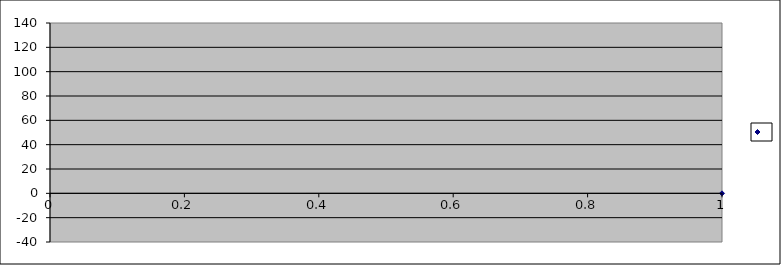
| Category | Series 0 |
|---|---|
| 0 | 0 |
| 1 | -0.1 |
| 2 | -0.1 |
| 3 | 0.2 |
| 4 | 1 |
| 5 | 2.2 |
| 6 | 2.7 |
| 7 | 2.8 |
| 8 | 4.9 |
| 9 | 7.3 |
| 10 | 10.6 |
| 11 | 5.5 |
| 12 | 7.3 |
| 13 | 8.7 |
| 14 | 9.2 |
| 15 | 9.2 |
| 16 | 9.7 |
| 17 | 14.1 |
| 18 | 15.9 |
| 19 | -2.5 |
| 20 | -1.7 |
| 21 | 0.3 |
| 22 | 0.4 |
| 23 | 0.5 |
| 24 | 0.6 |
| 25 | 1.2 |
| 26 | 1.6 |
| 27 | 1.6 |
| 28 | 2 |
| 29 | 2.3 |
| 30 | 2.4 |
| 31 | 2.6 |
| 32 | 3.1 |
| 33 | 3.8 |
| 34 | 5.4 |
| 35 | -1.1 |
| 36 | 1.1 |
| 37 | 1.3 |
| 38 | 2.7 |
| 39 | 2.9 |
| 40 | 4 |
| 41 | 4.2 |
| 42 | 4.3 |
| 43 | 4.3 |
| 44 | 4.7 |
| 45 | 5 |
| 46 | 5.3 |
| 47 | 5.4 |
| 48 | 5.7 |
| 49 | 5.7 |
| 50 | 5.9 |
| 51 | 6.2 |
| 52 | 6.3 |
| 53 | 6.7 |
| 54 | 7.3 |
| 55 | 7.6 |
| 56 | 8.3 |
| 57 | 8.8 |
| 58 | 9.2 |
| 59 | 9.2 |
| 60 | 9.4 |
| 61 | 9.6 |
| 62 | 9.9 |
| 63 | 10 |
| 64 | 10 |
| 65 | 10.3 |
| 66 | 10.9 |
| 67 | 11.9 |
| 68 | 12.6 |
| 69 | 12.9 |
| 70 | 13.5 |
| 71 | 13.6 |
| 72 | 13.7 |
| 73 | 14.4 |
| 74 | 14.5 |
| 75 | 15.9 |
| 76 | 15.9 |
| 77 | 16.6 |
| 78 | 16.7 |
| 79 | 16.8 |
| 80 | 17 |
| 81 | 17.4 |
| 82 | 17.5 |
| 83 | 17.7 |
| 84 | 18.6 |
| 85 | -6.4 |
| 86 | -5.7 |
| 87 | -2.7 |
| 88 | -1.7 |
| 89 | -1.2 |
| 90 | 0.2 |
| 91 | 0.6 |
| 92 | 2.2 |
| 93 | 2.4 |
| 94 | 2.9 |
| 95 | 3.3 |
| 96 | 3.4 |
| 97 | 3.4 |
| 98 | 3.5 |
| 99 | 3.5 |
| 100 | 3.5 |
| 101 | 3.7 |
| 102 | 4 |
| 103 | 4.3 |
| 104 | 4.5 |
| 105 | 4.7 |
| 106 | 4.8 |
| 107 | 6.1 |
| 108 | 6.3 |
| 109 | 6.8 |
| 110 | 7.3 |
| 111 | 7.7 |
| 112 | 8.2 |
| 113 | 9.2 |
| 114 | 9.5 |
| 115 | 10.6 |
| 116 | 14.9 |
| 117 | 15.6 |
| 118 | 18.5 |
| 119 | -3.65 |
| 120 | -2.02 |
| 121 | -1.09 |
| 122 | -0.64 |
| 123 | 0.07 |
| 124 | 0.11 |
| 125 | 1.01 |
| 126 | 1.23 |
| 127 | 1.55 |
| 128 | 1.83 |
| 129 | 2.2 |
| 130 | 2.27 |
| 131 | 3.26 |
| 132 | 3.43 |
| 133 | 3.58 |
| 134 | 4.34 |
| 135 | 4.91 |
| 136 | 5.02 |
| 137 | 5.03 |
| 138 | 5.04 |
| 139 | 5.58 |
| 140 | 5.72 |
| 141 | 5.89 |
| 142 | 5.94 |
| 143 | -9.09 |
| 144 | -8.06 |
| 145 | -8.01 |
| 146 | -7.98 |
| 147 | -2.9 |
| 148 | -2.74 |
| 149 | -2.74 |
| 150 | -2.67 |
| 151 | -2.59 |
| 152 | -1.97 |
| 153 | -1.43 |
| 154 | -0.44 |
| 155 | -5.4 |
| 156 | -5.3 |
| 157 | -4.2 |
| 158 | -2.9 |
| 159 | -2.5 |
| 160 | -1.9 |
| 161 | -1.2 |
| 162 | -0.4 |
| 163 | -0.2 |
| 164 | -0.2 |
| 165 | 0.6 |
| 166 | 0.6 |
| 167 | 0.7 |
| 168 | 0.8 |
| 169 | 0.8 |
| 170 | 0.9 |
| 171 | 0.9 |
| 172 | 1.3 |
| 173 | 1.3 |
| 174 | 1.4 |
| 175 | 1.5 |
| 176 | 1.5 |
| 177 | 1.5 |
| 178 | 1.5 |
| 179 | 1.7 |
| 180 | 1.7 |
| 181 | 1.9 |
| 182 | 2 |
| 183 | 2.4 |
| 184 | 3.2 |
| 185 | 3.3 |
| 186 | 3.3 |
| 187 | 3.5 |
| 188 | 3.6 |
| 189 | 3.7 |
| 190 | 3.7 |
| 191 | 3.7 |
| 192 | 3.8 |
| 193 | 3.9 |
| 194 | 4.1 |
| 195 | 4.4 |
| 196 | 4.6 |
| 197 | 4.7 |
| 198 | 4.7 |
| 199 | 4.9 |
| 200 | 5.1 |
| 201 | 5.2 |
| 202 | 5.2 |
| 203 | 5.2 |
| 204 | 5.5 |
| 205 | 5.5 |
| 206 | 5.6 |
| 207 | 5.8 |
| 208 | 5.9 |
| 209 | 6.1 |
| 210 | 6.4 |
| 211 | 6.5 |
| 212 | 6.6 |
| 213 | 6.6 |
| 214 | 6.7 |
| 215 | 6.8 |
| 216 | 6.8 |
| 217 | 7.5 |
| 218 | 8.4 |
| 219 | -21.3 |
| 220 | -16.9 |
| 221 | -10.1 |
| 222 | -7.3 |
| 223 | -2.7 |
| 224 | -2.5 |
| 225 | -1.1 |
| 226 | -0.9 |
| 227 | -7.2 |
| 228 | -7.2 |
| 229 | -6.1 |
| 230 | -4.7 |
| 231 | -3.5 |
| 232 | -3 |
| 233 | -2.1 |
| 234 | -1.4 |
| 235 | 2 |
| 236 | 2.4 |
| 237 | 2.5 |
| 238 | 2.7 |
| 239 | 2.8 |
| 240 | 3.4 |
| 241 | 3.9 |
| 242 | 4.1 |
| 243 | 4.2 |
| 244 | -0.5 |
| 245 | -0.3 |
| 246 | 0 |
| 247 | 0 |
| 248 | 0.3 |
| 249 | 0.5 |
| 250 | 1.8 |
| 251 | 2 |
| 252 | 2.4 |
| 253 | 2.5 |
| 254 | 2.5 |
| 255 | 2.6 |
| 256 | 2.6 |
| 257 | 2.6 |
| 258 | 2.8 |
| 259 | 2.9 |
| 260 | 2.9 |
| 261 | 2.9 |
| 262 | 3.1 |
| 263 | 3.1 |
| 264 | 3.1 |
| 265 | 3.4 |
| 266 | 3.4 |
| 267 | 3.6 |
| 268 | 3.7 |
| 269 | 3.7 |
| 270 | 3.7 |
| 271 | 3.7 |
| 272 | 3.7 |
| 273 | 3.7 |
| 274 | 3.8 |
| 275 | 3.9 |
| 276 | 3.9 |
| 277 | 3.9 |
| 278 | 3.9 |
| 279 | 3.9 |
| 280 | 3.9 |
| 281 | 4.1 |
| 282 | 4.2 |
| 283 | 4.2 |
| 284 | 4.4 |
| 285 | 4.4 |
| 286 | 4.4 |
| 287 | 4.4 |
| 288 | 4.4 |
| 289 | 4.7 |
| 290 | 4.7 |
| 291 | 4.9 |
| 292 | 4.9 |
| 293 | 4.9 |
| 294 | 5.1 |
| 295 | 5.1 |
| 296 | 5.2 |
| 297 | 5.2 |
| 298 | 5.2 |
| 299 | 5.2 |
| 300 | 5.4 |
| 301 | 5.4 |
| 302 | 5.4 |
| 303 | 5.4 |
| 304 | 5.4 |
| 305 | 5.5 |
| 306 | 5.5 |
| 307 | 5.6 |
| 308 | 5.6 |
| 309 | 5.7 |
| 310 | 5.7 |
| 311 | 5.7 |
| 312 | 5.7 |
| 313 | 5.7 |
| 314 | 5.7 |
| 315 | 5.8 |
| 316 | 6 |
| 317 | 6.2 |
| 318 | 6.5 |
| 319 | 6.5 |
| 320 | 6.7 |
| 321 | 6.7 |
| 322 | 7.2 |
| 323 | 7.2 |
| 324 | 7.5 |
| 325 | 7.5 |
| 326 | 7.8 |
| 327 | 8.5 |
| 328 | 8.8 |
| 329 | 10.3 |
| 330 | -9.7 |
| 331 | -8.5 |
| 332 | -8.5 |
| 333 | -6.9 |
| 334 | -6.8 |
| 335 | -5.9 |
| 336 | -5.8 |
| 337 | -5.7 |
| 338 | -5.5 |
| 339 | -5.4 |
| 340 | -4.9 |
| 341 | -4.6 |
| 342 | -4.4 |
| 343 | -4.4 |
| 344 | -4.1 |
| 345 | -4.1 |
| 346 | -4 |
| 347 | -3.9 |
| 348 | -3.6 |
| 349 | -3.6 |
| 350 | -3 |
| 351 | -2.9 |
| 352 | -2.5 |
| 353 | -2.3 |
| 354 | -2.2 |
| 355 | -1.9 |
| 356 | -0.9 |
| 357 | -0.8 |
| 358 | -0.6 |
| 359 | -0.6 |
| 360 | -0.4 |
| 361 | 2.2 |
| 362 | 2.5 |
| 363 | -6.06 |
| 364 | -5.48 |
| 365 | -5.46 |
| 366 | -4.4 |
| 367 | -4.29 |
| 368 | -3.38 |
| 369 | -2.8 |
| 370 | -2.12 |
| 371 | -1.92 |
| 372 | -1.22 |
| 373 | -0.73 |
| 374 | 0.75 |
| 375 | 0.86 |
| 376 | -11.633 |
| 377 | -1.329 |
| 378 | 0.604 |
| 379 | 1.468 |
| 380 | 3.262 |
| 381 | 5.869 |
| 382 | 6.814 |
| 383 | 7.475 |
| 384 | 8.125 |
| 385 | 9.097 |
| 386 | 9.157 |
| 387 | 9.535 |
| 388 | 12.019 |
| 389 | 12.192 |
| 390 | 14.42 |
| 391 | 14.49 |
| 392 | 15.742 |
| 393 | 15.94 |
| 394 | 17.097 |
| 395 | 17.485 |
| 396 | 18.292 |
| 397 | 20.046 |
| 398 | 20.8 |
| 399 | 21.65 |
| 400 | 22.275 |
| 401 | 22.497 |
| 402 | 23.163 |
| 403 | 23.21 |
| 404 | 23.541 |
| 405 | 23.541 |
| 406 | 24.877 |
| 407 | 26.634 |
| 408 | 28.863 |
| 409 | 29.101 |
| 410 | 29.439 |
| 411 | 29.758 |
| 412 | 31.802 |
| 413 | 32.853 |
| 414 | 37.576 |
| 415 | -11.9 |
| 416 | -8.2 |
| 417 | -4.8 |
| 418 | -3.8 |
| 419 | -1.5 |
| 420 | -0.5 |
| 421 | -0.3 |
| 422 | -0.2 |
| 423 | 1.6 |
| 424 | 3.9 |
| 425 | 4.4 |
| 426 | 5.3 |
| 427 | 5.4 |
| 428 | 5.6 |
| 429 | 6.1 |
| 430 | 6.1 |
| 431 | 6.4 |
| 432 | -4.7 |
| 433 | -4.3 |
| 434 | -4.1 |
| 435 | -3.4 |
| 436 | -3.3 |
| 437 | -3.1 |
| 438 | -2.6 |
| 439 | -2.5 |
| 440 | 1.6 |
| 441 | 1.7 |
| 442 | 2.6 |
| 443 | 2.7 |
| 444 | 2.8 |
| 445 | 3.4 |
| 446 | -2.32 |
| 447 | -1.76 |
| 448 | -1.54 |
| 449 | -0.99 |
| 450 | -0.76 |
| 451 | -0.26 |
| 452 | 0.61 |
| 453 | 0.72 |
| 454 | 0.93 |
| 455 | 1.26 |
| 456 | 1.77 |
| 457 | 3.32 |
| 458 | 3.37 |
| 459 | 3.41 |
| 460 | 3.42 |
| 461 | 3.59 |
| 462 | -5.3 |
| 463 | -5 |
| 464 | -4.84 |
| 465 | -4 |
| 466 | -3.6 |
| 467 | -3.2 |
| 468 | -2.7 |
| 469 | -1.5 |
| 470 | -1.4 |
| 471 | -1 |
| 472 | 0.1 |
| 473 | 0.5 |
| 474 | 0.7 |
| 475 | 1.8 |
| 476 | 4.6 |
| 477 | 4.9 |
| 478 | 5.5 |
| 479 | 5.8 |
| 480 | 6.3 |
| 481 | 6.4 |
| 482 | 6.5 |
| 483 | 6.8 |
| 484 | 6.9 |
| 485 | 7 |
| 486 | 7.2 |
| 487 | 12.1 |
| 488 | 12.2 |
| 489 | 13.5 |
| 490 | 13.7 |
| 491 | 14.6 |
| 492 | 15.1 |
| 493 | 15.4 |
| 494 | 15.6 |
| 495 | 15.6 |
| 496 | 15.9 |
| 497 | 16 |
| 498 | 16.1 |
| 499 | 16.1 |
| 500 | 16.7 |
| 501 | 17.6 |
| 502 | 0.07 |
| 503 | 0.11 |
| 504 | 1.23 |
| 505 | 1.37 |
| 506 | 1.47 |
| 507 | 2.38 |
| 508 | 2.93 |
| 509 | 3.16 |
| 510 | 3.53 |
| 511 | 3.76 |
| 512 | 3.81 |
| 513 | 3.97 |
| 514 | 4.04 |
| 515 | 4.34 |
| 516 | 4.42 |
| 517 | 4.52 |
| 518 | 4.58 |
| 519 | 4.6 |
| 520 | 4.69 |
| 521 | 5.01 |
| 522 | 5.02 |
| 523 | 5.03 |
| 524 | 5.63 |
| 525 | 5.89 |
| 526 | 5.94 |
| 527 | -10.5 |
| 528 | -9.8 |
| 529 | -5.7 |
| 530 | -5 |
| 531 | -4.7 |
| 532 | -3.7 |
| 533 | -12.4 |
| 534 | -6.9 |
| 535 | -6.6 |
| 536 | -6.2 |
| 537 | -5.4 |
| 538 | -4.4 |
| 539 | -3.8 |
| 540 | -3 |
| 541 | -2.2 |
| 542 | -1.8 |
| 543 | -1.1 |
| 544 | 0.3 |
| 545 | 0.9 |
| 546 | 4.5 |
| 547 | 4.8 |
| 548 | 8 |
| 549 | 10.5 |
| 550 | -6.7 |
| 551 | -6.1 |
| 552 | -4.5 |
| 553 | -4.3 |
| 554 | -4.3 |
| 555 | -3.4 |
| 556 | -3.2 |
| 557 | -0.2 |
| 558 | -0.2 |
| 559 | 1.9 |
| 560 | 2.5 |
| 561 | 2.8 |
| 562 | -9 |
| 563 | -16.4 |
| 564 | -16.1 |
| 565 | -9 |
| 566 | -8.7 |
| 567 | -25 |
| 568 | -22.9 |
| 569 | -21.2 |
| 570 | -20.7 |
| 571 | -20.2 |
| 572 | -19.6 |
| 573 | -19.5 |
| 574 | -18.7 |
| 575 | -18.6 |
| 576 | -18.6 |
| 577 | -17.3 |
| 578 | -25.3 |
| 579 | -21.3 |
| 580 | -21.1 |
| 581 | -19.2 |
| 582 | -19.1 |
| 583 | -18.4 |
| 584 | -16.8 |
| 585 | -15.4 |
| 586 | -15.2 |
| 587 | -14.2 |
| 588 | -13.2 |
| 589 | -12.9 |
| 590 | -10.5 |
| 591 | 3.8 |
| 592 | -20.4 |
| 593 | -14.5 |
| 594 | -14.2 |
| 595 | -14 |
| 596 | -13.9 |
| 597 | -13.8 |
| 598 | -13.6 |
| 599 | -13.4 |
| 600 | -12.7 |
| 601 | -11.9 |
| 602 | -11.9 |
| 603 | -11.8 |
| 604 | -11.7 |
| 605 | -11.6 |
| 606 | -11.2 |
| 607 | -10.8 |
| 608 | -10.4 |
| 609 | -10.3 |
| 610 | -10.2 |
| 611 | -9 |
| 612 | -8.9 |
| 613 | -8.8 |
| 614 | -1.2 |
| 615 | -0.4 |
| 616 | 0.2 |
| 617 | 1 |
| 618 | 1.6 |
| 619 | 2 |
| 620 | 2.1 |
| 621 | 2.2 |
| 622 | 3 |
| 623 | 3.1 |
| 624 | 3.4 |
| 625 | 3.7 |
| 626 | 3.8 |
| 627 | 4.5 |
| 628 | 4.7 |
| 629 | 7.2 |
| 630 | -12.3 |
| 631 | -12 |
| 632 | -11.7 |
| 633 | -11.2 |
| 634 | -11 |
| 635 | -9.6 |
| 636 | -9.1 |
| 637 | -8.9 |
| 638 | -8.8 |
| 639 | -8.2 |
| 640 | -8 |
| 641 | -6.2 |
| 642 | -6 |
| 643 | -5.2 |
| 644 | -4.6 |
| 645 | -3.6 |
| 646 | -15.8 |
| 647 | -13.5 |
| 648 | -15.8 |
| 649 | -15.3 |
| 650 | -15.3 |
| 651 | -10.1 |
| 652 | -14.3 |
| 653 | -15.6 |
| 654 | -11.2 |
| 655 | -19 |
| 656 | -13.8 |
| 657 | -16.9 |
| 658 | -16.4 |
| 659 | -7.9 |
| 660 | -8 |
| 661 | -9.9 |
| 662 | -8.8 |
| 663 | -9.2 |
| 664 | -5.5 |
| 665 | -7.1 |
| 666 | -4.8 |
| 667 | -7.2 |
| 668 | -5.5 |
| 669 | -8.3 |
| 670 | -3.9 |
| 671 | -6.8 |
| 672 | -0.6 |
| 673 | -4.7 |
| 674 | -4 |
| 675 | 1.5 |
| 676 | -6.7 |
| 677 | -0.7 |
| 678 | -3.1 |
| 679 | -6.5 |
| 680 | 0.5 |
| 681 | -7.2 |
| 682 | -3.7 |
| 683 | -4.9 |
| 684 | -5.72 |
| 685 | -7.77 |
| 686 | -5.43 |
| 687 | -6.54 |
| 688 | -2.61 |
| 689 | -6.01 |
| 690 | -7.4 |
| 691 | -6.98 |
| 692 | -5.19 |
| 693 | -4.41 |
| 694 | -3.96 |
| 695 | -5.89 |
| 696 | -9.3 |
| 697 | -3.81 |
| 698 | -4.89 |
| 699 | -3.52 |
| 700 | -1.96 |
| 701 | -6.91 |
| 702 | -0.94 |
| 703 | -17.9 |
| 704 | -14.9 |
| 705 | -14.6 |
| 706 | -14.1 |
| 707 | -13.2 |
| 708 | -12.7 |
| 709 | -9.1 |
| 710 | -7.8 |
| 711 | -7.5 |
| 712 | -6.1 |
| 713 | -19.8 |
| 714 | -19.5 |
| 715 | -14.9 |
| 716 | -12.7 |
| 717 | -12.5 |
| 718 | -12.2 |
| 719 | -12.1 |
| 720 | -11.7 |
| 721 | -11.5 |
| 722 | -10.8 |
| 723 | -10.7 |
| 724 | -10.6 |
| 725 | -10.3 |
| 726 | -10.2 |
| 727 | -10 |
| 728 | -9.8 |
| 729 | -9.4 |
| 730 | -9.3 |
| 731 | -8.9 |
| 732 | -7.5 |
| 733 | -5.9 |
| 734 | -5.8 |
| 735 | -5 |
| 736 | -2.2 |
| 737 | -14.1 |
| 738 | -13.7 |
| 739 | -13.5 |
| 740 | -13.5 |
| 741 | -13.4 |
| 742 | -12.8 |
| 743 | -12.6 |
| 744 | -12.5 |
| 745 | -12.1 |
| 746 | -12.1 |
| 747 | -11.8 |
| 748 | -11.7 |
| 749 | -11.7 |
| 750 | -11.6 |
| 751 | -11.2 |
| 752 | -11.2 |
| 753 | -10.8 |
| 754 | -10.7 |
| 755 | -10.7 |
| 756 | -10.6 |
| 757 | -10.6 |
| 758 | -10.5 |
| 759 | -10.5 |
| 760 | -9.9 |
| 761 | -9.8 |
| 762 | -9.8 |
| 763 | -9.5 |
| 764 | -9.4 |
| 765 | -9.4 |
| 766 | -9.2 |
| 767 | -20.2 |
| 768 | -18.4 |
| 769 | -16.4 |
| 770 | -15.9 |
| 771 | -15.6 |
| 772 | -15.1 |
| 773 | -15.1 |
| 774 | -14.9 |
| 775 | -14.9 |
| 776 | -14.6 |
| 777 | -14.6 |
| 778 | -14.1 |
| 779 | -14.1 |
| 780 | -13.9 |
| 781 | -13.9 |
| 782 | -13.6 |
| 783 | -13.3 |
| 784 | -13.1 |
| 785 | -12.6 |
| 786 | -12.1 |
| 787 | -11.6 |
| 788 | -11.3 |
| 789 | -10.3 |
| 790 | -10.3 |
| 791 | -9 |
| 792 | -8.8 |
| 793 | -6 |
| 794 | -5.5 |
| 795 | -4.8 |
| 796 | 1.6 |
| 797 | -17.7 |
| 798 | -14.7 |
| 799 | -14.2 |
| 800 | -13.4 |
| 801 | -13.1 |
| 802 | -12.9 |
| 803 | -12.9 |
| 804 | -12.9 |
| 805 | -12 |
| 806 | -12 |
| 807 | -11.7 |
| 808 | -9.1 |
| 809 | -8 |
| 810 | -7.4 |
| 811 | -5.7 |
| 812 | -3.1 |
| 813 | -0.3 |
| 814 | -0.1 |
| 815 | 20.1 |
| 816 | 20.9 |
| 817 | 21 |
| 818 | -27.3 |
| 819 | -22 |
| 820 | -21.9 |
| 821 | -15.5 |
| 822 | -15.5 |
| 823 | -14.6 |
| 824 | -14 |
| 825 | -14 |
| 826 | -13.4 |
| 827 | -12 |
| 828 | -10.9 |
| 829 | -29.9 |
| 830 | -29.3 |
| 831 | -28.9 |
| 832 | -28.2 |
| 833 | -26 |
| 834 | -26 |
| 835 | -23.9 |
| 836 | -22.5 |
| 837 | -21.6 |
| 838 | -20.5 |
| 839 | -20 |
| 840 | -19.5 |
| 841 | -18 |
| 842 | -17.5 |
| 843 | -16.6 |
| 844 | -16.5 |
| 845 | -16.3 |
| 846 | -15.4 |
| 847 | -15.1 |
| 848 | -14.6 |
| 849 | -14.5 |
| 850 | -14 |
| 851 | -13.5 |
| 852 | -13.3 |
| 853 | -12.9 |
| 854 | -12.3 |
| 855 | -12.2 |
| 856 | -11.9 |
| 857 | -11.8 |
| 858 | -11.7 |
| 859 | -11.3 |
| 860 | -11.2 |
| 861 | -10.7 |
| 862 | -10.3 |
| 863 | -5.4 |
| 864 | -5.2 |
| 865 | -4.1 |
| 866 | -3.1 |
| 867 | -13.42 |
| 868 | -12.644 |
| 869 | -11.8 |
| 870 | -11.554 |
| 871 | -11.134 |
| 872 | -10.944 |
| 873 | -10.833 |
| 874 | -10.616 |
| 875 | -10.356 |
| 876 | -10.317 |
| 877 | -10.28 |
| 878 | -10.28 |
| 879 | -10.264 |
| 880 | -10.097 |
| 881 | -10.097 |
| 882 | -10.059 |
| 883 | -10.025 |
| 884 | -10.025 |
| 885 | -9.989 |
| 886 | -9.838 |
| 887 | -9.801 |
| 888 | -9.801 |
| 889 | -9.748 |
| 890 | -9.579 |
| 891 | -9.543 |
| 892 | -9.543 |
| 893 | -9.514 |
| 894 | -9.49 |
| 895 | -9.384 |
| 896 | -9.319 |
| 897 | -9.297 |
| 898 | -9.283 |
| 899 | -9.259 |
| 900 | -9.259 |
| 901 | -9.06 |
| 902 | -9.06 |
| 903 | -9.027 |
| 904 | -9.027 |
| 905 | -8.974 |
| 906 | -8.863 |
| 907 | -8.77 |
| 908 | -8.749 |
| 909 | -8.716 |
| 910 | -8.716 |
| 911 | -8.542 |
| 912 | -8.542 |
| 913 | -8.512 |
| 914 | -8.494 |
| 915 | -8.494 |
| 916 | -8.494 |
| 917 | -8.458 |
| 918 | -8.458 |
| 919 | -8.431 |
| 920 | -8.363 |
| 921 | -8.343 |
| 922 | -8.254 |
| 923 | -8.254 |
| 924 | -8.239 |
| 925 | -8.2 |
| 926 | -8.083 |
| 927 | -8.006 |
| 928 | -7.991 |
| 929 | -7.991 |
| 930 | -7.991 |
| 931 | -7.747 |
| 932 | -7.747 |
| 933 | -7.747 |
| 934 | -7.747 |
| 935 | -7.747 |
| 936 | -7.684 |
| 937 | -7.586 |
| 938 | -7.473 |
| 939 | -7.231 |
| 940 | -7.231 |
| 941 | -7.068 |
| 942 | -6.715 |
| 943 | -6.708 |
| 944 | -6.652 |
| 945 | -6.456 |
| 946 | -6.453 |
| 947 | -6.394 |
| 948 | -6.197 |
| 949 | -6.033 |
| 950 | -4.907 |
| 951 | -4.846 |
| 952 | -4.588 |
| 953 | -3.901 |
| 954 | -3.901 |
| 955 | -3.874 |
| 956 | -3.391 |
| 957 | -3.184 |
| 958 | -2.625 |
| 959 | -2.583 |
| 960 | -2.325 |
| 961 | -2.067 |
| 962 | -1.89 |
| 963 | -1.35 |
| 964 | -1.292 |
| 965 | -0.854 |
| 966 | -12.5 |
| 967 | -12.3 |
| 968 | -11.2 |
| 969 | -11.1 |
| 970 | -11 |
| 971 | -10.9 |
| 972 | -10.8 |
| 973 | -10.7 |
| 974 | -10.5 |
| 975 | -10.4 |
| 976 | -10.3 |
| 977 | -10.2 |
| 978 | -9.7 |
| 979 | -9.7 |
| 980 | -9.6 |
| 981 | -9.6 |
| 982 | -9.5 |
| 983 | -9.3 |
| 984 | -9.3 |
| 985 | -9.2 |
| 986 | -9.2 |
| 987 | -9 |
| 988 | -8.8 |
| 989 | -8.7 |
| 990 | -8.4 |
| 991 | -8.4 |
| 992 | -8.4 |
| 993 | -8.4 |
| 994 | -8.4 |
| 995 | -8.3 |
| 996 | -8.2 |
| 997 | -8.2 |
| 998 | -8 |
| 999 | -7.9 |
| 1000 | -7.9 |
| 1001 | -7.8 |
| 1002 | -7.6 |
| 1003 | -7.5 |
| 1004 | -7.5 |
| 1005 | -7.4 |
| 1006 | -7.4 |
| 1007 | -7.1 |
| 1008 | -7 |
| 1009 | -6.7 |
| 1010 | -6.3 |
| 1011 | -6 |
| 1012 | -4.6 |
| 1013 | -2.9 |
| 1014 | -2.8 |
| 1015 | -2.4 |
| 1016 | -1.9 |
| 1017 | -29.9 |
| 1018 | -29.3 |
| 1019 | -28.9 |
| 1020 | -28.2 |
| 1021 | -26 |
| 1022 | -26 |
| 1023 | -23.9 |
| 1024 | -23 |
| 1025 | -22.5 |
| 1026 | -21.6 |
| 1027 | -21.5 |
| 1028 | -20.9 |
| 1029 | -20 |
| 1030 | -19.5 |
| 1031 | -18.1 |
| 1032 | -18 |
| 1033 | -17.9 |
| 1034 | -17 |
| 1035 | -17 |
| 1036 | -16.7 |
| 1037 | -16.6 |
| 1038 | -16.6 |
| 1039 | -16.5 |
| 1040 | -16.4 |
| 1041 | -15.4 |
| 1042 | -15.4 |
| 1043 | -15.1 |
| 1044 | -14.9 |
| 1045 | -14.7 |
| 1046 | -14.6 |
| 1047 | -14.1 |
| 1048 | -13.5 |
| 1049 | -13.2 |
| 1050 | -12.7 |
| 1051 | -15.8 |
| 1052 | -15.7 |
| 1053 | -15.5 |
| 1054 | -15.5 |
| 1055 | -15.5 |
| 1056 | -15.4 |
| 1057 | -15.4 |
| 1058 | -15.4 |
| 1059 | -15.3 |
| 1060 | -15.3 |
| 1061 | -15.3 |
| 1062 | -15.2 |
| 1063 | -15.2 |
| 1064 | -15.2 |
| 1065 | -15.2 |
| 1066 | -15.2 |
| 1067 | -15.1 |
| 1068 | -15.1 |
| 1069 | -15.1 |
| 1070 | -15.1 |
| 1071 | -15.1 |
| 1072 | -15 |
| 1073 | -15 |
| 1074 | -15 |
| 1075 | -15 |
| 1076 | -15 |
| 1077 | -15 |
| 1078 | -14.9 |
| 1079 | -14.9 |
| 1080 | -14.8 |
| 1081 | -14.8 |
| 1082 | -14.8 |
| 1083 | -14.8 |
| 1084 | -14.7 |
| 1085 | -14.7 |
| 1086 | -14.7 |
| 1087 | -14.6 |
| 1088 | -14.6 |
| 1089 | -14.6 |
| 1090 | -14.5 |
| 1091 | -14.5 |
| 1092 | -14.3 |
| 1093 | -14.2 |
| 1094 | -13.9 |
| 1095 | -13.8 |
| 1096 | -13.8 |
| 1097 | -13.8 |
| 1098 | -13.8 |
| 1099 | -13.7 |
| 1100 | -13.6 |
| 1101 | -13.6 |
| 1102 | -13.4 |
| 1103 | -13.2 |
| 1104 | -13 |
| 1105 | -12.9 |
| 1106 | -12.8 |
| 1107 | -12.8 |
| 1108 | -12.7 |
| 1109 | -12.7 |
| 1110 | -12.6 |
| 1111 | -12.5 |
| 1112 | -12.5 |
| 1113 | -12.5 |
| 1114 | -12.5 |
| 1115 | -12.5 |
| 1116 | -12.4 |
| 1117 | -12.4 |
| 1118 | -12.3 |
| 1119 | -12.3 |
| 1120 | -12.3 |
| 1121 | -12.3 |
| 1122 | -12.3 |
| 1123 | -12.3 |
| 1124 | -12.2 |
| 1125 | -12.2 |
| 1126 | -12.2 |
| 1127 | -12.2 |
| 1128 | -12.2 |
| 1129 | -12.2 |
| 1130 | -12.2 |
| 1131 | -12.1 |
| 1132 | -12.1 |
| 1133 | -12 |
| 1134 | -12 |
| 1135 | -12 |
| 1136 | -11.9 |
| 1137 | -11.9 |
| 1138 | -11.8 |
| 1139 | -11.4 |
| 1140 | -11.4 |
| 1141 | 15.8 |
| 1142 | 16.3 |
| 1143 | 16.4 |
| 1144 | 16.6 |
| 1145 | 16.7 |
| 1146 | 16.8 |
| 1147 | 16.9 |
| 1148 | 17.4 |
| 1149 | 17.6 |
| 1150 | 17.9 |
| 1151 | 18 |
| 1152 | 18.2 |
| 1153 | 18.3 |
| 1154 | 18.4 |
| 1155 | 18.4 |
| 1156 | 18.7 |
| 1157 | 18.7 |
| 1158 | 22.3 |
| 1159 | 23.9 |
| 1160 | 23.9 |
| 1161 | 25.1 |
| 1162 | 27.3 |
| 1163 | 27.3 |
| 1164 | 28.3 |
| 1165 | 28.4 |
| 1166 | 28.7 |
| 1167 | 28.8 |
| 1168 | 28.8 |
| 1169 | 28.9 |
| 1170 | 29 |
| 1171 | 32.3 |
| 1172 | 33.1 |
| 1173 | 33.2 |
| 1174 | 34.4 |
| 1175 | 35.5 |
| 1176 | 35.8 |
| 1177 | 35.9 |
| 1178 | 36 |
| 1179 | 36.1 |
| 1180 | 36.2 |
| 1181 | 36.6 |
| 1182 | 36.6 |
| 1183 | 36.7 |
| 1184 | 36.9 |
| 1185 | 37.2 |
| 1186 | 37.5 |
| 1187 | 38.4 |
| 1188 | 40.5 |
| 1189 | 41.8 |
| 1190 | 41.8 |
| 1191 | 43.1 |
| 1192 | 43.1 |
| 1193 | 43.2 |
| 1194 | 43.7 |
| 1195 | 43.8 |
| 1196 | 43.9 |
| 1197 | 44.6 |
| 1198 | 45.6 |
| 1199 | 46.2 |
| 1200 | 46.5 |
| 1201 | 47 |
| 1202 | 55.8 |
| 1203 | 15.3 |
| 1204 | 17.5 |
| 1205 | 20 |
| 1206 | 20.1 |
| 1207 | 21.7 |
| 1208 | 22.2 |
| 1209 | 23 |
| 1210 | 23.1 |
| 1211 | 23.9 |
| 1212 | 24.2 |
| 1213 | 24.6 |
| 1214 | 24.7 |
| 1215 | 25.8 |
| 1216 | 27.4 |
| 1217 | 27.8 |
| 1218 | 27.8 |
| 1219 | 28.2 |
| 1220 | 28.4 |
| 1221 | 28.4 |
| 1222 | 30.5 |
| 1223 | 30.5 |
| 1224 | 31 |
| 1225 | 31.1 |
| 1226 | 31.2 |
| 1227 | 31.5 |
| 1228 | 31.8 |
| 1229 | 32 |
| 1230 | 33.4 |
| 1231 | 33.7 |
| 1232 | 35.1 |
| 1233 | 35.2 |
| 1234 | 35.3 |
| 1235 | 35.6 |
| 1236 | 35.6 |
| 1237 | 36.7 |
| 1238 | 37.4 |
| 1239 | 37.6 |
| 1240 | 37.8 |
| 1241 | 37.9 |
| 1242 | 38.1 |
| 1243 | 38.2 |
| 1244 | 38.4 |
| 1245 | 38.9 |
| 1246 | 39.1 |
| 1247 | 39.2 |
| 1248 | 39.4 |
| 1249 | 39.8 |
| 1250 | 39.8 |
| 1251 | 40.9 |
| 1252 | 41.4 |
| 1253 | 41.9 |
| 1254 | 42.8 |
| 1255 | 43.3 |
| 1256 | 43.7 |
| 1257 | 44.2 |
| 1258 | 44.9 |
| 1259 | 45.5 |
| 1260 | 48.5 |
| 1261 | 49.2 |
| 1262 | -7.67 |
| 1263 | -6.04 |
| 1264 | -5.4 |
| 1265 | -5.3 |
| 1266 | -4.7 |
| 1267 | -4.44 |
| 1268 | -3.1 |
| 1269 | -2.7 |
| 1270 | -2.5 |
| 1271 | -1.45 |
| 1272 | -1.4 |
| 1273 | -1.2 |
| 1274 | -1.2 |
| 1275 | -0.9 |
| 1276 | -0.57 |
| 1277 | -0.1 |
| 1278 | 1.38 |
| 1279 | 1.4 |
| 1280 | 1.7 |
| 1281 | 1.8 |
| 1282 | 2.1 |
| 1283 | 2.2 |
| 1284 | 2.36 |
| 1285 | 2.6 |
| 1286 | 3 |
| 1287 | 3.1 |
| 1288 | 3.3 |
| 1289 | 3.75 |
| 1290 | 4.3 |
| 1291 | 4.8 |
| 1292 | 5.1 |
| 1293 | 6 |
| 1294 | 6.3 |
| 1295 | 6.3 |
| 1296 | 6.8 |
| 1297 | 6.9 |
| 1298 | 7 |
| 1299 | 7.2 |
| 1300 | 7.4 |
| 1301 | 8.4 |
| 1302 | 9.6 |
| 1303 | 10 |
| 1304 | 12.1 |
| 1305 | 12.5 |
| 1306 | 13.5 |
| 1307 | 14.4 |
| 1308 | 14.9 |
| 1309 | 14.9 |
| 1310 | 14.9 |
| 1311 | 15.7 |
| 1312 | 16.7 |
| 1313 | 17.3 |
| 1314 | 18.9 |
| 1315 | 19.5 |
| 1316 | 20.3 |
| 1317 | 21.3 |
| 1318 | 21.4 |
| 1319 | 21.6 |
| 1320 | 22.5 |
| 1321 | 24.4 |
| 1322 | 25.5 |
| 1323 | 28.1 |
| 1324 | 28.8 |
| 1325 | 31.1 |
| 1326 | 33.6 |
| 1327 | 35.1 |
| 1328 | 35.5 |
| 1329 | 36.5 |
| 1330 | 38.3 |
| 1331 | 39.5 |
| 1332 | 32.7 |
| 1333 | 33.3 |
| 1334 | 34.4 |
| 1335 | 34.6 |
| 1336 | 35.1 |
| 1337 | 35.2 |
| 1338 | 36.4 |
| 1339 | 36.4 |
| 1340 | 36.9 |
| 1341 | 36.9 |
| 1342 | 37.2 |
| 1343 | 37.3 |
| 1344 | 37.5 |
| 1345 | 37.5 |
| 1346 | 38.3 |
| 1347 | 38.3 |
| 1348 | 38.5 |
| 1349 | 38.5 |
| 1350 | 38.5 |
| 1351 | 38.6 |
| 1352 | 38.8 |
| 1353 | 38.8 |
| 1354 | 38.8 |
| 1355 | 39.1 |
| 1356 | 39.3 |
| 1357 | 39.5 |
| 1358 | 39.5 |
| 1359 | 39.5 |
| 1360 | 39.6 |
| 1361 | 39.6 |
| 1362 | 39.7 |
| 1363 | 39.9 |
| 1364 | 39.9 |
| 1365 | 40 |
| 1366 | 40 |
| 1367 | 40.2 |
| 1368 | 40.3 |
| 1369 | 40.4 |
| 1370 | 40.4 |
| 1371 | 40.5 |
| 1372 | 40.6 |
| 1373 | 40.6 |
| 1374 | 40.6 |
| 1375 | 40.9 |
| 1376 | 41.3 |
| 1377 | 41.4 |
| 1378 | 41.5 |
| 1379 | 41.6 |
| 1380 | 41.7 |
| 1381 | 41.9 |
| 1382 | 42 |
| 1383 | 42.1 |
| 1384 | 42.2 |
| 1385 | 42.5 |
| 1386 | 42.8 |
| 1387 | 43.9 |
| 1388 | 46.3 |
| 1389 | -2.36 |
| 1390 | -0.95 |
| 1391 | -0.7 |
| 1392 | -0.7 |
| 1393 | -0.02 |
| 1394 | 0.04 |
| 1395 | 0.2 |
| 1396 | 0.26 |
| 1397 | 0.27 |
| 1398 | 0.4 |
| 1399 | 0.59 |
| 1400 | 1.33 |
| 1401 | 2.3 |
| 1402 | 2.4 |
| 1403 | 3.2 |
| 1404 | 3.84 |
| 1405 | 4.53 |
| 1406 | 4.58 |
| 1407 | 4.62 |
| 1408 | 5.54 |
| 1409 | 5.9 |
| 1410 | 6.67 |
| 1411 | 7.12 |
| 1412 | 7.77 |
| 1413 | 8.07 |
| 1414 | 8.9 |
| 1415 | 9.27 |
| 1416 | 9.31 |
| 1417 | 11.98 |
| 1418 | 12.81 |
| 1419 | 24.84 |
| 1420 | 28.7 |
| 1421 | 34.86 |
| 1422 | 2.3 |
| 1423 | 2.5 |
| 1424 | 2.6 |
| 1425 | 2.6 |
| 1426 | 2.9 |
| 1427 | 4.1 |
| 1428 | 4.4 |
| 1429 | 6.3 |
| 1430 | 7.2 |
| 1431 | 13.5 |
| 1432 | 17.8 |
| 1433 | 18.5 |
| 1434 | 18.6 |
| 1435 | 18.9 |
| 1436 | 19.1 |
| 1437 | 20.2 |
| 1438 | 20.3 |
| 1439 | 20.3 |
| 1440 | 21.2 |
| 1441 | 23.2 |
| 1442 | 28.9 |
| 1443 | 29.7 |
| 1444 | 30.1 |
| 1445 | 31 |
| 1446 | 33 |
| 1447 | 34.5 |
| 1448 | 34.9 |
| 1449 | 35.3 |
| 1450 | 35.5 |
| 1451 | 36.1 |
| 1452 | 36.3 |
| 1453 | 36.7 |
| 1454 | 37.5 |
| 1455 | 37.5 |
| 1456 | 37.9 |
| 1457 | 38 |
| 1458 | -10.5 |
| 1459 | -7.42 |
| 1460 | -6.9 |
| 1461 | -6.15 |
| 1462 | -5.8 |
| 1463 | -5.79 |
| 1464 | -5.78 |
| 1465 | -5.61 |
| 1466 | -4.86 |
| 1467 | -4.8 |
| 1468 | -3.87 |
| 1469 | -3.62 |
| 1470 | -3.56 |
| 1471 | -3.02 |
| 1472 | -3.01 |
| 1473 | -2.68 |
| 1474 | -2.4 |
| 1475 | -2.34 |
| 1476 | -1.6 |
| 1477 | -1.42 |
| 1478 | 0.56 |
| 1479 | 0.95 |
| 1480 | 2.15 |
| 1481 | 2.47 |
| 1482 | 3.85 |
| 1483 | 4.53 |
| 1484 | 4.73 |
| 1485 | 5.59 |
| 1486 | 6.63 |
| 1487 | 7.47 |
| 1488 | 11.06 |
| 1489 | 19.19 |
| 1490 | -7.4 |
| 1491 | -6.5 |
| 1492 | -6 |
| 1493 | -5.4 |
| 1494 | -5.2 |
| 1495 | -5.1 |
| 1496 | -4.8 |
| 1497 | -4.7 |
| 1498 | -4.5 |
| 1499 | -4.2 |
| 1500 | -3.7 |
| 1501 | -3.6 |
| 1502 | -3.1 |
| 1503 | -2.6 |
| 1504 | -2.4 |
| 1505 | -1.5 |
| 1506 | 1.2 |
| 1507 | 1.2 |
| 1508 | -7.68 |
| 1509 | -7.55 |
| 1510 | -7.02 |
| 1511 | -6.92 |
| 1512 | -9.3 |
| 1513 | -5.3 |
| 1514 | -4.9 |
| 1515 | -1.1 |
| 1516 | -0.1 |
| 1517 | 0.9 |
| 1518 | 3.1 |
| 1519 | 5.8 |
| 1520 | 11.7 |
| 1521 | -16.9 |
| 1522 | -16.5 |
| 1523 | -14.7 |
| 1524 | -13.9 |
| 1525 | -12.9 |
| 1526 | -10.6 |
| 1527 | -10.5 |
| 1528 | -9 |
| 1529 | -7.8 |
| 1530 | -3.8 |
| 1531 | -2.8 |
| 1532 | -2.5 |
| 1533 | -1.4 |
| 1534 | -0.6 |
| 1535 | -0.5 |
| 1536 | 0.6 |
| 1537 | -7.6 |
| 1538 | -7.4 |
| 1539 | -7.3 |
| 1540 | -6.8 |
| 1541 | -6.8 |
| 1542 | -6 |
| 1543 | -6 |
| 1544 | -4.9 |
| 1545 | -4.7 |
| 1546 | -4.1 |
| 1547 | -3.6 |
| 1548 | -3.5 |
| 1549 | -3.5 |
| 1550 | -3.3 |
| 1551 | -3.3 |
| 1552 | -3.3 |
| 1553 | -3.3 |
| 1554 | 0.4 |
| 1555 | 2 |
| 1556 | 3 |
| 1557 | 4.9 |
| 1558 | 5 |
| 1559 | 6.5 |
| 1560 | 8.1 |
| 1561 | 11.8 |
| 1562 | -14.2 |
| 1563 | -13.9 |
| 1564 | -13.7 |
| 1565 | -13.3 |
| 1566 | -13.1 |
| 1567 | -12.3 |
| 1568 | -12.3 |
| 1569 | -11.7 |
| 1570 | -11.6 |
| 1571 | -11.6 |
| 1572 | -11 |
| 1573 | -10.9 |
| 1574 | -10.9 |
| 1575 | -10.8 |
| 1576 | -10.5 |
| 1577 | -9.5 |
| 1578 | -9.3 |
| 1579 | -8.7 |
| 1580 | -8.5 |
| 1581 | -8.2 |
| 1582 | -3 |
| 1583 | -2.9 |
| 1584 | -10.5 |
| 1585 | -10.2 |
| 1586 | -9.7 |
| 1587 | -8.2 |
| 1588 | -7.6 |
| 1589 | -7.4 |
| 1590 | -6.7 |
| 1591 | -6.2 |
| 1592 | -6.1 |
| 1593 | -5.5 |
| 1594 | -5.22 |
| 1595 | -4.98 |
| 1596 | -4.9 |
| 1597 | -4.9 |
| 1598 | -4.8 |
| 1599 | -4.5 |
| 1600 | -3.82 |
| 1601 | -3.8 |
| 1602 | -3.7 |
| 1603 | -3.6 |
| 1604 | -3.31 |
| 1605 | -3.2 |
| 1606 | -2.7 |
| 1607 | -2.4 |
| 1608 | -2.2 |
| 1609 | 0.5 |
| 1610 | 0.8 |
| 1611 | 1.4 |
| 1612 | 2.1 |
| 1613 | 2.8 |
| 1614 | 5.2 |
| 1615 | 7.6 |
| 1616 | -5.9 |
| 1617 | -5.4 |
| 1618 | -5.4 |
| 1619 | -5.3 |
| 1620 | -5.2 |
| 1621 | -5.2 |
| 1622 | -5 |
| 1623 | -5 |
| 1624 | -5 |
| 1625 | -4.6 |
| 1626 | -4.5 |
| 1627 | -4.3 |
| 1628 | -4.2 |
| 1629 | -4.2 |
| 1630 | -4.1 |
| 1631 | -4 |
| 1632 | -3.9 |
| 1633 | -3.8 |
| 1634 | -3.8 |
| 1635 | -3.7 |
| 1636 | -3.7 |
| 1637 | -3.7 |
| 1638 | -3.6 |
| 1639 | -3.6 |
| 1640 | -3.5 |
| 1641 | -3.4 |
| 1642 | -3.3 |
| 1643 | -3.1 |
| 1644 | -3 |
| 1645 | -2.8 |
| 1646 | -2.5 |
| 1647 | -2.2 |
| 1648 | -1.8 |
| 1649 | -0.3 |
| 1650 | 0.9 |
| 1651 | 6.6 |
| 1652 | -7.6 |
| 1653 | -7.4 |
| 1654 | -6.8 |
| 1655 | -6 |
| 1656 | -6 |
| 1657 | -4.7 |
| 1658 | -4.1 |
| 1659 | -3.6 |
| 1660 | -3.5 |
| 1661 | -3.3 |
| 1662 | -3.3 |
| 1663 | -2.1 |
| 1664 | 5 |
| 1665 | 11.6 |
| 1666 | 11.7 |
| 1667 | 12.3 |
| 1668 | 12.3 |
| 1669 | 12.5 |
| 1670 | 12.7 |
| 1671 | 12.8 |
| 1672 | 13.1 |
| 1673 | 13.1 |
| 1674 | 13.2 |
| 1675 | 13.2 |
| 1676 | 13.9 |
| 1677 | 14.1 |
| 1678 | 14.5 |
| 1679 | 14.9 |
| 1680 | 15.2 |
| 1681 | 15.7 |
| 1682 | 16.4 |
| 1683 | 17.7 |
| 1684 | 17.7 |
| 1685 | 20.2 |
| 1686 | 20.5 |
| 1687 | 39.5 |
| 1688 | 5.4 |
| 1689 | 9.7 |
| 1690 | 10.4 |
| 1691 | 10.8 |
| 1692 | 10.8 |
| 1693 | 11 |
| 1694 | 11.3 |
| 1695 | 11.9 |
| 1696 | 12.9 |
| 1697 | 13.1 |
| 1698 | 14.2 |
| 1699 | 14.2 |
| 1700 | 14.2 |
| 1701 | 14.7 |
| 1702 | 14.8 |
| 1703 | 14.9 |
| 1704 | 15.2 |
| 1705 | 16.4 |
| 1706 | 19.8 |
| 1707 | 20.6 |
| 1708 | 20.6 |
| 1709 | 21.8 |
| 1710 | 25.3 |
| 1711 | 26 |
| 1712 | 26.1 |
| 1713 | 28.2 |
| 1714 | 29.2 |
| 1715 | 35.2 |
| 1716 | 126 |
| 1717 | 8.78 |
| 1718 | 8.91 |
| 1719 | 9.43 |
| 1720 | 10.17 |
| 1721 | 10.27 |
| 1722 | 11.38 |
| 1723 | 11.62 |
| 1724 | 11.82 |
| 1725 | 12.07 |
| 1726 | 13.17 |
| 1727 | 13.62 |
| 1728 | 14.53 |
| 1729 | 14.68 |
| 1730 | 15.15 |
| 1731 | 16.21 |
| 1732 | 29.72 |
| 1733 | 32.24 |
| 1734 | 32.36 |
| 1735 | 32.61 |
| 1736 | 33.69 |
| 1737 | 34.09 |
| 1738 | 34.11 |
| 1739 | 34.31 |
| 1740 | 34.68 |
| 1741 | 35 |
| 1742 | 35.35 |
| 1743 | 35.79 |
| 1744 | 37.64 |
| 1745 | 37.82 |
| 1746 | 37.99 |
| 1747 | 38.47 |
| 1748 | 39 |
| 1749 | 39.13 |
| 1750 | 40.66 |
| 1751 | 9.25 |
| 1752 | 9.65 |
| 1753 | 10.16 |
| 1754 | 10.29 |
| 1755 | 10.73 |
| 1756 | 11.6 |
| 1757 | 12.1 |
| 1758 | 12.5 |
| 1759 | 12.6 |
| 1760 | 13.47 |
| 1761 | 15.93 |
| 1762 | 16.87 |
| 1763 | 17.83 |
| 1764 | 18.17 |
| 1765 | 19.56 |
| 1766 | 17 |
| 1767 | 18.3 |
| 1768 | 19 |
| 1769 | 22.3 |
| 1770 | 24.8 |
| 1771 | 26.6 |
| 1772 | 30.3 |
| 1773 | -3.46 |
| 1774 | -3.33 |
| 1775 | 2.2 |
| 1776 | 2.68 |
| 1777 | 2.81 |
| 1778 | 3.25 |
| 1779 | 3.38 |
| 1780 | 6.22 |
| 1781 | 21.61 |
| 1782 | 22.37 |
| 1783 | 22.6 |
| 1784 | 25.07 |
| 1785 | -12.04 |
| 1786 | -10.48 |
| 1787 | -9.4 |
| 1788 | -9.17 |
| 1789 | -8.53 |
| 1790 | -8.25 |
| 1791 | -7.86 |
| 1792 | -7.81 |
| 1793 | -7.62 |
| 1794 | -7.56 |
| 1795 | -7.41 |
| 1796 | -7.18 |
| 1797 | -6.29 |
| 1798 | -5.99 |
| 1799 | -3.33 |
| 1800 | -2.67 |
| 1801 | -2.28 |
| 1802 | -2.17 |
| 1803 | -1.36 |
| 1804 | -1.24 |
| 1805 | -0.19 |
| 1806 | 0.73 |
| 1807 | 1.85 |
| 1808 | 3.72 |
| 1809 | 18.3 |
| 1810 | 18.8 |
| 1811 | 19 |
| 1812 | 19.1 |
| 1813 | 19.3 |
| 1814 | 20 |
| 1815 | 20 |
| 1816 | 20.3 |
| 1817 | 20.8 |
| 1818 | 21.2 |
| 1819 | 21.4 |
| 1820 | 21.6 |
| 1821 | 21.6 |
| 1822 | 21.7 |
| 1823 | 21.8 |
| 1824 | 21.9 |
| 1825 | 22.2 |
| 1826 | 27.9 |
| 1827 | 28.3 |
| 1828 | 28.4 |
| 1829 | -11.9 |
| 1830 | -11.5 |
| 1831 | -8.5 |
| 1832 | -8.2 |
| 1833 | -6.9 |
| 1834 | -5.7 |
| 1835 | -5.3 |
| 1836 | -5.1 |
| 1837 | -4.4 |
| 1838 | -3.3 |
| 1839 | -2.7 |
| 1840 | 1.5 |
| 1841 | 4.5 |
| 1842 | 5.5 |
| 1843 | 10 |
| 1844 | 10.8 |
| 1845 | 15.1 |
| 1846 | 0 |
| 1847 | -11 |
| 1848 | -3.4 |
| 1849 | -12.5 |
| 1850 | 3.81 |
| 1851 | 6.8 |
| 1852 | 10.5 |
| 1853 | 11.2 |
| 1854 | 12.1 |
| 1855 | 13.6 |
| 1856 | 13.9 |
| 1857 | 14.4 |
| 1858 | 16.7 |
| 1859 | 17.9 |
| 1860 | 17.9 |
| 1861 | 18.7 |
| 1862 | 18.9 |
| 1863 | 19.2 |
| 1864 | 19.9 |
| 1865 | 20 |
| 1866 | 20.5 |
| 1867 | 21.1 |
| 1868 | 21.5 |
| 1869 | 23.2 |
| 1870 | 23.3 |
| 1871 | 23.3 |
| 1872 | 23.4 |
| 1873 | 24.1 |
| 1874 | -15 |
| 1875 | -14.6 |
| 1876 | -13.6 |
| 1877 | -12.8 |
| 1878 | -11.8 |
| 1879 | -11.2 |
| 1880 | -7.3 |
| 1881 | -7.1 |
| 1882 | -4.1 |
| 1883 | -4.1 |
| 1884 | -2.6 |
| 1885 | -2.6 |
| 1886 | -1.3 |
| 1887 | -0.8 |
| 1888 | -0.3 |
| 1889 | -0.1 |
| 1890 | -6.9 |
| 1891 | -6.67 |
| 1892 | -6.3 |
| 1893 | -6.24 |
| 1894 | -5.55 |
| 1895 | -5.45 |
| 1896 | -5.11 |
| 1897 | -5.01 |
| 1898 | -4.99 |
| 1899 | -4.87 |
| 1900 | -4.84 |
| 1901 | -3.87 |
| 1902 | -3.61 |
| 1903 | -3.4 |
| 1904 | -3.34 |
| 1905 | -2.48 |
| 1906 | -1.38 |
| 1907 | -8.9 |
| 1908 | -8.6 |
| 1909 | -8.5 |
| 1910 | -7.8 |
| 1911 | -7.4 |
| 1912 | -6.1 |
| 1913 | -5.6 |
| 1914 | -4.7 |
| 1915 | -3.1 |
| 1916 | -2.5 |
| 1917 | -2.2 |
| 1918 | -2.1 |
| 1919 | -0.8 |
| 1920 | 0.4 |
| 1921 | 1.5 |
| 1922 | -13.66 |
| 1923 | -11.81 |
| 1924 | -10.89 |
| 1925 | -9.45 |
| 1926 | -9.35 |
| 1927 | -8.58 |
| 1928 | -5.9 |
| 1929 | -4.37 |
| 1930 | -1.96 |
| 1931 | -7.83 |
| 1932 | -6.94 |
| 1933 | -6.94 |
| 1934 | -5.8 |
| 1935 | -5.73 |
| 1936 | -5.16 |
| 1937 | -5.04 |
| 1938 | -5.01 |
| 1939 | -4.96 |
| 1940 | -4.84 |
| 1941 | -4.35 |
| 1942 | -4 |
| 1943 | -3.88 |
| 1944 | -3.82 |
| 1945 | -3.63 |
| 1946 | -3.53 |